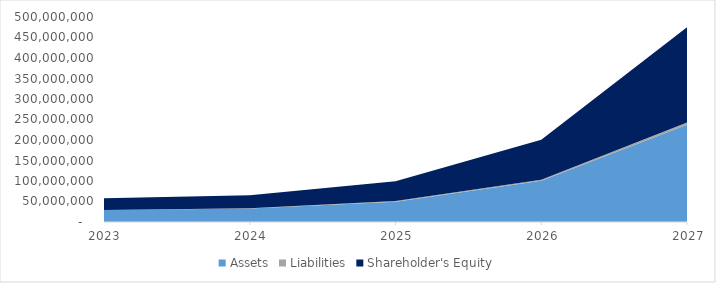
| Category | Assets | Liabilities | Shareholder's Equity |
|---|---|---|---|
| 2023-12-01 | 29010626.228 | 509016.393 | 28501609.835 |
| 2024-12-01 | 32764053.258 | 871106.557 | 31892946.7 |
| 2025-12-01 | 49606003.016 | 1552407.787 | 48053595.229 |
| 2026-12-01 | 100407614.814 | 2856800.717 | 97550814.097 |
| 2027-12-01 | 237362399.212 | 5384756.019 | 231977643.193 |